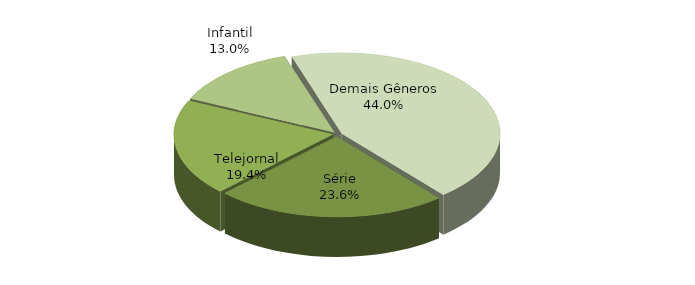
| Category | Series 0 |
|---|---|
| Série | 0.236 |
| Telejornal | 0.194 |
| Infantil | 0.13 |
| Demais Gêneros | 0.44 |